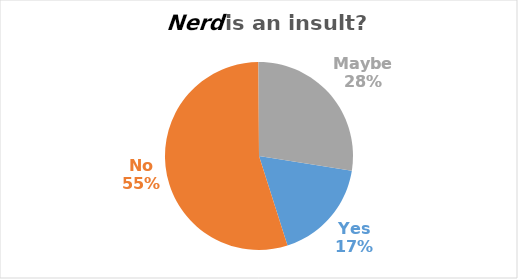
| Category | Series 0 |
|---|---|
| Yes | 88 |
| No | 274 |
| Maybe | 138 |